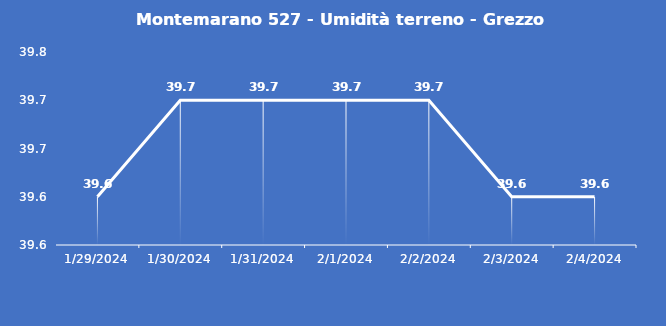
| Category | Montemarano 527 - Umidità terreno - Grezzo (%VWC) |
|---|---|
| 1/29/24 | 39.6 |
| 1/30/24 | 39.7 |
| 1/31/24 | 39.7 |
| 2/1/24 | 39.7 |
| 2/2/24 | 39.7 |
| 2/3/24 | 39.6 |
| 2/4/24 | 39.6 |